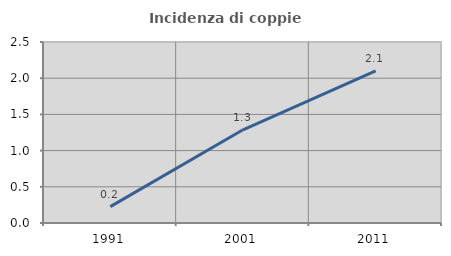
| Category | Incidenza di coppie miste |
|---|---|
| 1991.0 | 0.226 |
| 2001.0 | 1.288 |
| 2011.0 | 2.103 |